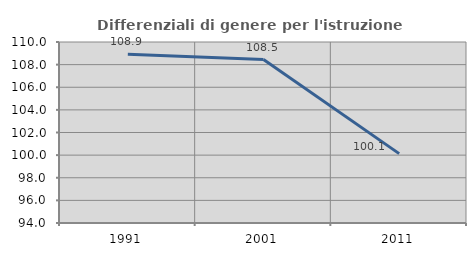
| Category | Differenziali di genere per l'istruzione superiore |
|---|---|
| 1991.0 | 108.918 |
| 2001.0 | 108.453 |
| 2011.0 | 100.133 |